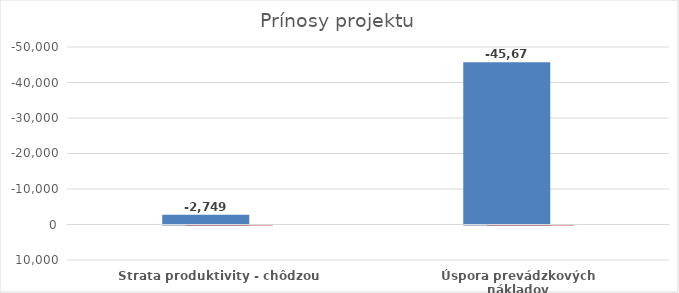
| Category | Series 0 | Series 1 |
|---|---|---|
| Strata produktivity - chôdzou | -2749.325 | 0.057 |
| Úspora prevádzkových nákladov | -45677.182 | 0.943 |